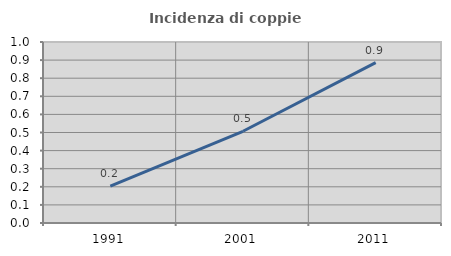
| Category | Incidenza di coppie miste |
|---|---|
| 1991.0 | 0.203 |
| 2001.0 | 0.507 |
| 2011.0 | 0.886 |